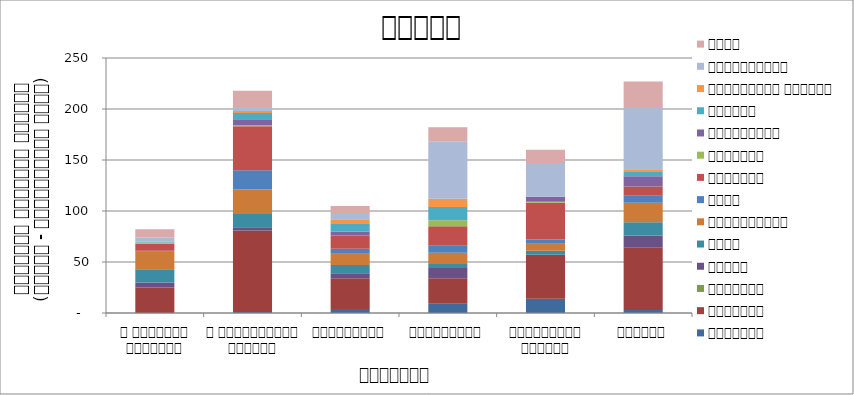
| Category | सुरक्षा | राजनीति | आन्दोलन | न्याय | शासन | अर्थतन्त्र | समाज | कुटनीति | वातावरण | स्वास्थ्य  | शिक्षा | प्राकृतिक प्रकोप | भ्रष्टाचार | अन्य |
|---|---|---|---|---|---|---|---|---|---|---|---|---|---|---|
| द हिमालयन टाइम्स् | 0 | 25 | 0 | 5 | 13 | 17 | 1 | 7 | 1 | 0 | 1 | 0 | 4 | 8 |
| द काठमाण्डौं पोस्ट् | 1 | 80 | 0 | 3 | 13 | 24 | 19 | 43 | 1 | 6 | 6 | 2 | 4 | 16 |
| रिपब्लिका | 4 | 30 | 0 | 5 | 8 | 11 | 5 | 13 | 0 | 4 | 8 | 4 | 5 | 8 |
| कान्तिपुर | 9 | 25 | 0 | 10 | 4 | 11 | 7 | 19 | 6 | 0 | 13 | 8 | 56 | 14 |
| अन्नपूर्ण पोस्ट् | 14 | 43 | 0 | 0 | 4 | 7 | 4 | 36 | 1 | 5 | 0 | 0 | 33 | 13 |
| नागरिक | 3 | 61 | 0 | 12 | 13 | 19 | 7 | 9 | 0 | 10 | 5 | 2 | 61 | 25 |